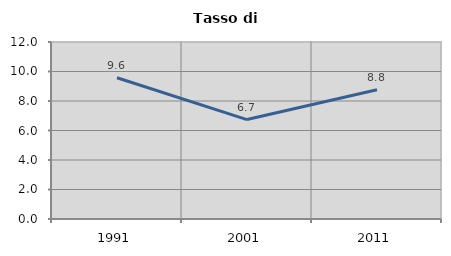
| Category | Tasso di disoccupazione   |
|---|---|
| 1991.0 | 9.576 |
| 2001.0 | 6.742 |
| 2011.0 | 8.759 |